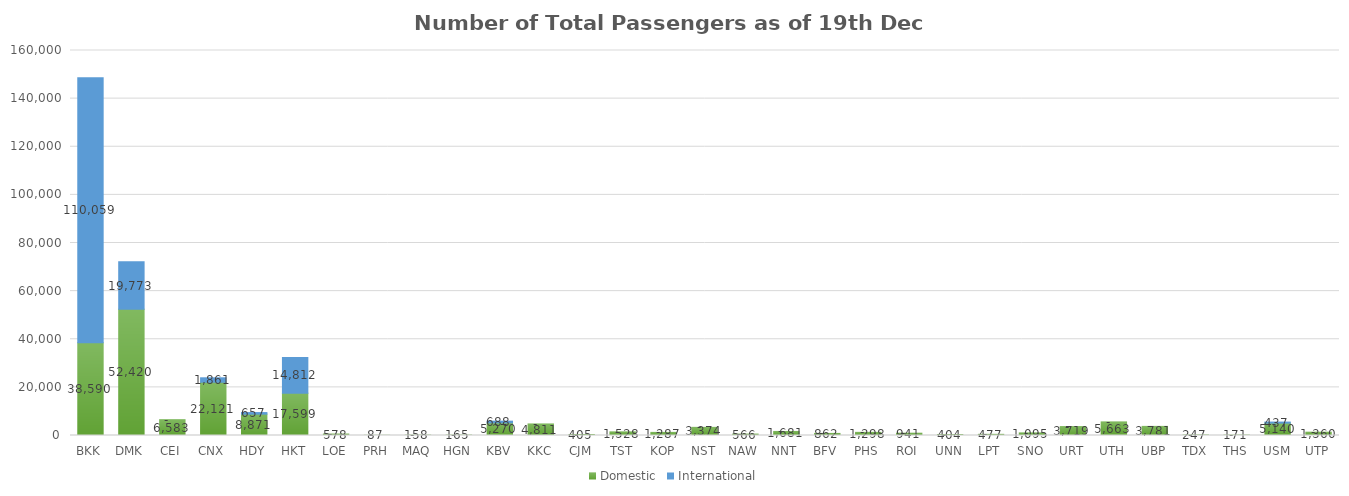
| Category | Domestic | International |
|---|---|---|
| BKK | 38590 | 110059 |
| DMK | 52420 | 19773 |
| CEI | 6583 | 0 |
| CNX | 22121 | 1861 |
| HDY | 8871 | 657 |
| HKT | 17599 | 14812 |
| LOE | 578 | 0 |
| PRH | 87 | 0 |
| MAQ | 158 | 0 |
| HGN | 165 | 0 |
| KBV | 5270 | 688 |
| KKC | 4811 | 0 |
| CJM | 405 | 0 |
| TST | 1528 | 0 |
| KOP | 1287 | 0 |
| NST | 3374 | 0 |
| NAW | 566 | 0 |
| NNT | 1681 | 0 |
| BFV | 862 | 0 |
| PHS | 1298 | 0 |
| ROI | 941 | 0 |
| UNN | 404 | 0 |
| LPT | 477 | 0 |
| SNO | 1095 | 0 |
| URT | 3719 | 0 |
| UTH | 5663 | 0 |
| UBP | 3781 | 0 |
| TDX | 247 | 0 |
| THS | 171 | 0 |
| USM | 5140 | 437 |
| UTP | 1360 | 0 |